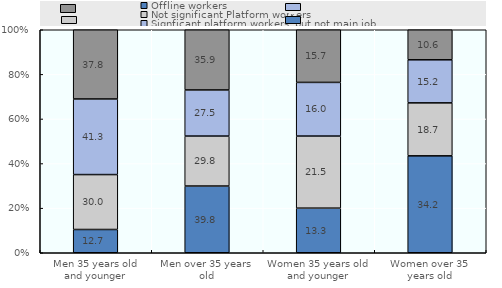
| Category | Offline workers | Not significant Platform workers | Signficant platform workers, but not main job | Mainly platform workers |
|---|---|---|---|---|
| Men 35 years old and younger | 12.7 | 30 | 41.3 | 37.8 |
| Men over 35 years old | 39.8 | 29.8 | 27.5 | 35.9 |
| Women 35 years old and younger | 13.3 | 21.5 | 16 | 15.7 |
| Women over 35 years old | 34.2 | 18.7 | 15.2 | 10.6 |